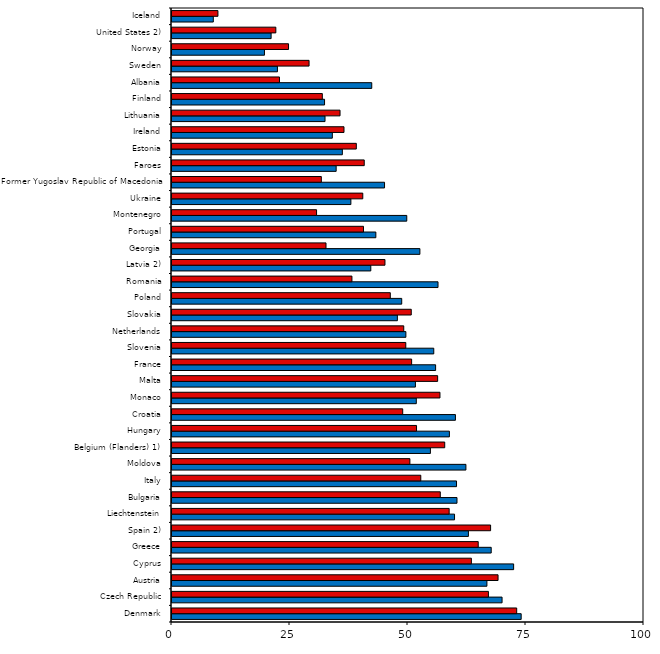
| Category | Boys | Girls |
|---|---|---|
| Denmark | 73.98 | 73.03 |
| Czech Republic | 69.93 | 67.04 |
| Austria | 66.72 | 69.08 |
| Cyprus | 72.38 | 63.43 |
| Greece | 67.63 | 64.88 |
| Spain 2) | 62.8 | 67.5 |
| Liechtenstein | 59.86 | 58.72 |
| Bulgaria | 60.38 | 56.84 |
| Italy | 60.28 | 52.71 |
| Moldova | 62.27 | 50.4 |
| Belgium (Flanders) 1) | 54.75 | 57.78 |
| Hungary | 58.77 | 51.81 |
| Croatia | 60.05 | 48.88 |
| Monaco | 51.76 | 56.77 |
| Malta | 51.57 | 56.28 |
| France | 55.85 | 50.77 |
| Slovenia | 55.46 | 49.53 |
| Netherlands | 49.55 | 49.1 |
| Slovakia | 47.75 | 50.69 |
| Poland | 48.67 | 46.25 |
| Romania | 56.36 | 38.12 |
| Latvia 2) | 42.12 | 45.12 |
| Georgia | 52.52 | 32.63 |
| Portugal | 43.19 | 40.57 |
| Montenegro | 49.74 | 30.63 |
| Ukraine | 37.9 | 40.42 |
| Former Yugoslav Republic of Macedonia | 45.03 | 31.64 |
| Faroes | 34.78 | 40.73 |
| Estonia | 36.09 | 39.05 |
| Ireland | 33.97 | 36.44 |
| Lithuania | 32.42 | 35.6 |
| Finland | 32.32 | 31.85 |
| Albania | 42.32 | 22.77 |
| Sweden | 22.34 | 29.04 |
| Norway | 19.59 | 24.69 |
| United States 2) | 21 | 22 |
| Iceland | 8.75 | 9.73 |